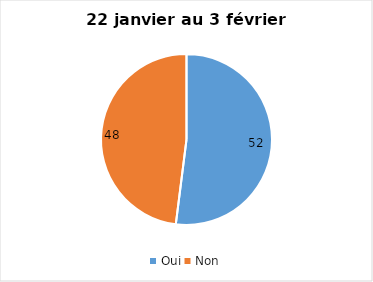
| Category | Series 0 |
|---|---|
| Oui | 52 |
| Non | 48 |